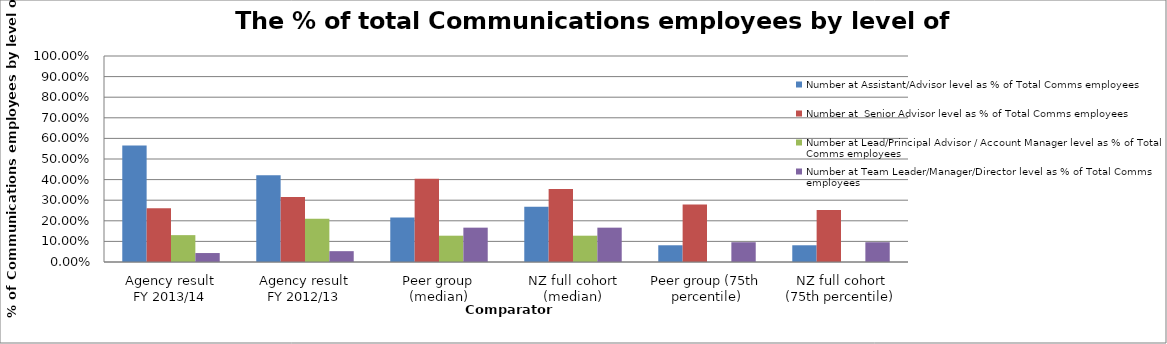
| Category | Number at Assistant/Advisor level as % of Total Comms employees | Number at  Senior Advisor level as % of Total Comms employees | Number at Lead/Principal Advisor / Account Manager level as % of Total Comms employees | Number at Team Leader/Manager/Director level as % of Total Comms employees |
|---|---|---|---|---|
| Agency result
FY 2013/14 | 0.565 | 0.261 | 0.13 | 0.044 |
| Agency result
FY 2012/13 | 0.421 | 0.316 | 0.21 | 0.053 |
| Peer group (median) | 0.216 | 0.404 | 0.128 | 0.167 |
| NZ full cohort (median) | 0.268 | 0.355 | 0.128 | 0.167 |
| Peer group (75th percentile) | 0.081 | 0.279 | 0 | 0.096 |
| NZ full cohort (75th percentile) | 0.081 | 0.253 | 0 | 0.096 |